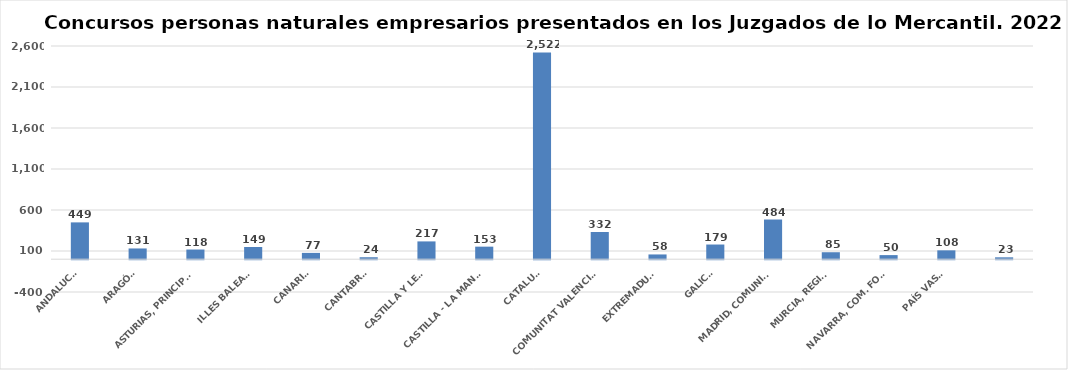
| Category | Series 0 |
|---|---|
| ANDALUCÍA | 449 |
| ARAGÓN | 131 |
| ASTURIAS, PRINCIPADO | 118 |
| ILLES BALEARS | 149 |
| CANARIAS | 77 |
| CANTABRIA | 24 |
| CASTILLA Y LEÓN | 217 |
| CASTILLA - LA MANCHA | 153 |
| CATALUÑA | 2522 |
| COMUNITAT VALENCIANA | 332 |
| EXTREMADURA | 58 |
| GALICIA | 179 |
| MADRID, COMUNIDAD | 484 |
| MURCIA, REGIÓN | 85 |
| NAVARRA, COM. FORAL | 50 |
| PAÍS VASCO | 108 |